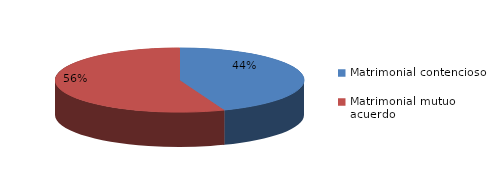
| Category | Series 0 |
|---|---|
| 0 | 117 |
| 1 | 148 |